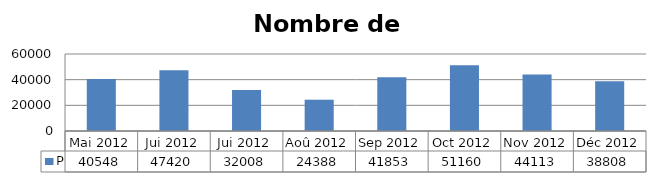
| Category | P |
|---|---|
| Mai 2012 | 40548 |
| Jui 2012 | 47420 |
| Jui 2012 | 32008 |
| Aoû 2012 | 24388 |
| Sep 2012 | 41853 |
| Oct 2012 | 51160 |
| Nov 2012 | 44113 |
| Déc 2012 | 38808 |